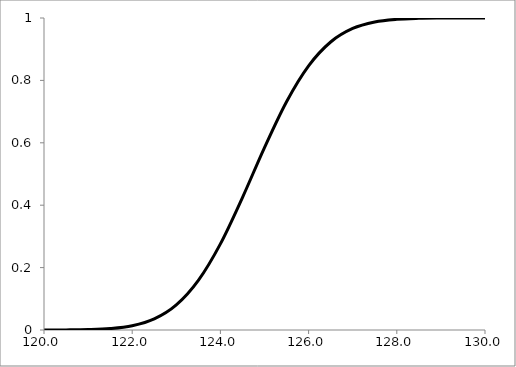
| Category | Series 0 |
|---|---|
| 120.0 | 0 |
| 120.5 | 0 |
| 121.0 | 0.001 |
| 121.5 | 0.004 |
| 122.0 | 0.014 |
| 122.5 | 0.035 |
| 123.0 | 0.08 |
| 123.5 | 0.159 |
| 124.0 | 0.276 |
| 124.5 | 0.425 |
| 125.0 | 0.585 |
| 125.5 | 0.732 |
| 126.0 | 0.847 |
| 126.5 | 0.923 |
| 127.0 | 0.966 |
| 127.5 | 0.987 |
| 128.0 | 0.996 |
| 128.5 | 0.999 |
| 129.0 | 1 |
| 129.5 | 1 |
| 130.0 | 1 |